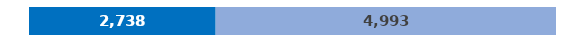
| Category | Current Supply | Finance Gap |
|---|---|---|
| 0 | 2738.048 | 4992.806 |